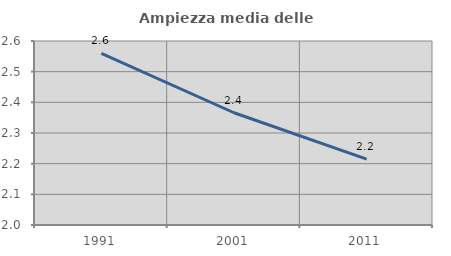
| Category | Ampiezza media delle famiglie |
|---|---|
| 1991.0 | 2.56 |
| 2001.0 | 2.366 |
| 2011.0 | 2.215 |